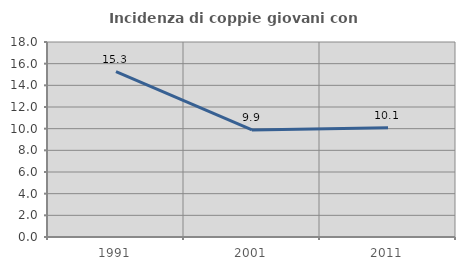
| Category | Incidenza di coppie giovani con figli |
|---|---|
| 1991.0 | 15.265 |
| 2001.0 | 9.88 |
| 2011.0 | 10.086 |